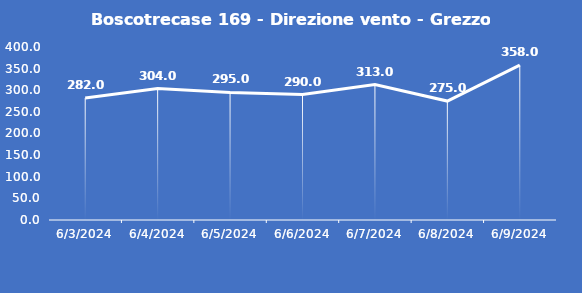
| Category | Boscotrecase 169 - Direzione vento - Grezzo (°N) |
|---|---|
| 6/3/24 | 282 |
| 6/4/24 | 304 |
| 6/5/24 | 295 |
| 6/6/24 | 290 |
| 6/7/24 | 313 |
| 6/8/24 | 275 |
| 6/9/24 | 358 |